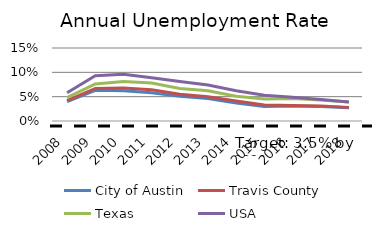
| Category | City of Austin | Travis County | Texas | USA |
|---|---|---|---|---|
| 2008.0 | 0.04 | 0.042 | 0.048 | 0.058 |
| 2009.0 | 0.063 | 0.067 | 0.076 | 0.093 |
| 2010.0 | 0.062 | 0.068 | 0.081 | 0.096 |
| 2011.0 | 0.058 | 0.064 | 0.078 | 0.089 |
| 2012.0 | 0.051 | 0.055 | 0.067 | 0.081 |
| 2013.0 | 0.046 | 0.05 | 0.062 | 0.074 |
| 2014.0 | 0.037 | 0.041 | 0.051 | 0.062 |
| 2015.0 | 0.03 | 0.033 | 0.045 | 0.053 |
| 2016.0 | 0.031 | 0.032 | 0.046 | 0.049 |
| 2017.0 | 0.03 | 0.031 | 0.043 | 0.044 |
| 2018.0 | 0.027 | 0.028 | 0.039 | 0.039 |